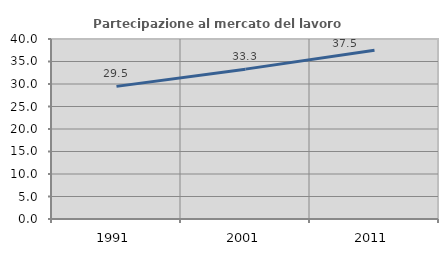
| Category | Partecipazione al mercato del lavoro  femminile |
|---|---|
| 1991.0 | 29.473 |
| 2001.0 | 33.302 |
| 2011.0 | 37.5 |